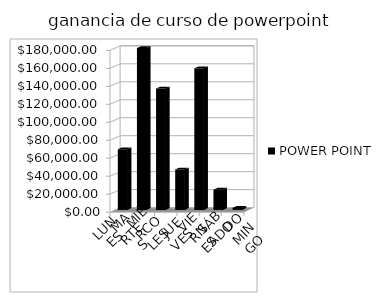
| Category | POWER POINT |
|---|---|
| LUNES | 67500 |
| MARTES | 180000 |
| MIÉRCOLES | 135000 |
| JUEVES | 45000 |
| VIERNES | 157500 |
| SÁBADO | 22500 |
| DOMINGO | 2250 |